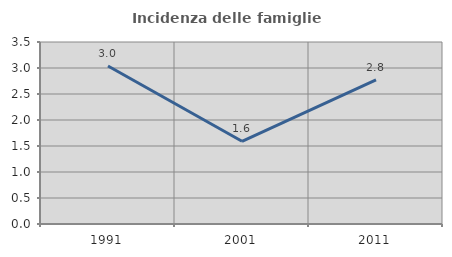
| Category | Incidenza delle famiglie numerose |
|---|---|
| 1991.0 | 3.038 |
| 2001.0 | 1.591 |
| 2011.0 | 2.772 |